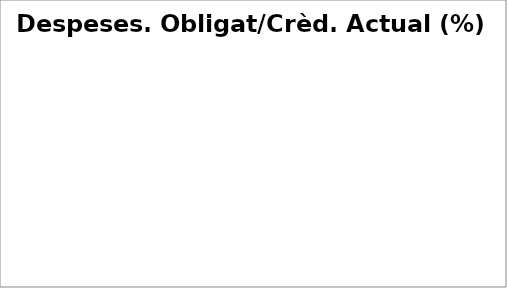
| Category | Series 0 |
|---|---|
| Despeses de personal | 0.804 |
| Despeses en béns corrents i serveis | 0.583 |
| Despeses financeres | 0.787 |
| Transferències corrents | 0.718 |
| Fons de contingència | 0 |
| Inversions reals | 0.429 |
| Transferències de capital | 0.54 |
| Actius financers | 0.595 |
| Passius financers | 0.999 |